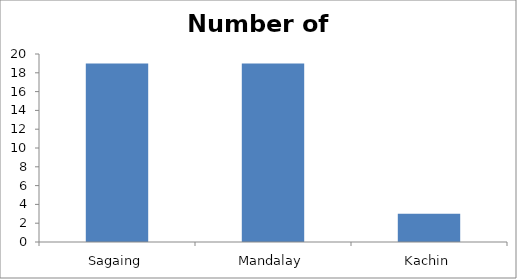
| Category | Number of Death |
|---|---|
| Sagaing | 19 |
| Mandalay | 19 |
| Kachin | 3 |